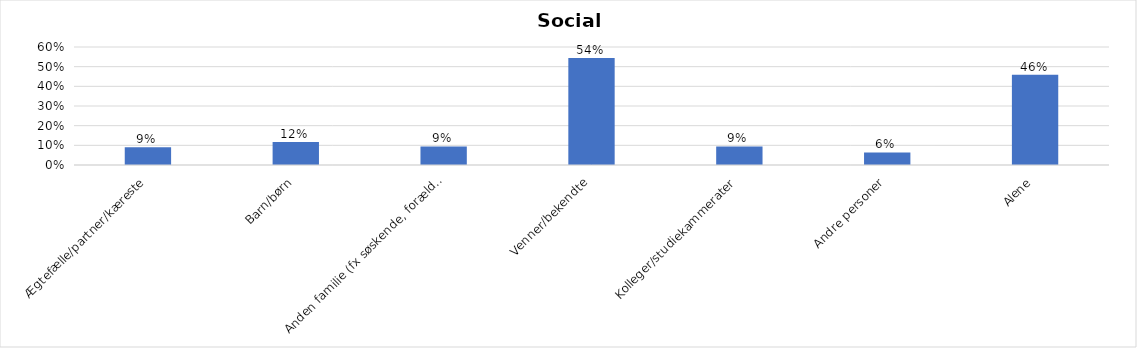
| Category | % |
|---|---|
| Ægtefælle/partner/kæreste | 0.09 |
| Barn/børn | 0.117 |
| Anden familie (fx søskende, forældre) | 0.094 |
| Venner/bekendte | 0.544 |
| Kolleger/studiekammerater | 0.094 |
| Andre personer | 0.064 |
| Alene | 0.46 |